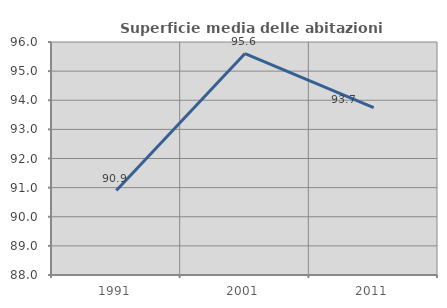
| Category | Superficie media delle abitazioni occupate |
|---|---|
| 1991.0 | 90.899 |
| 2001.0 | 95.605 |
| 2011.0 | 93.745 |